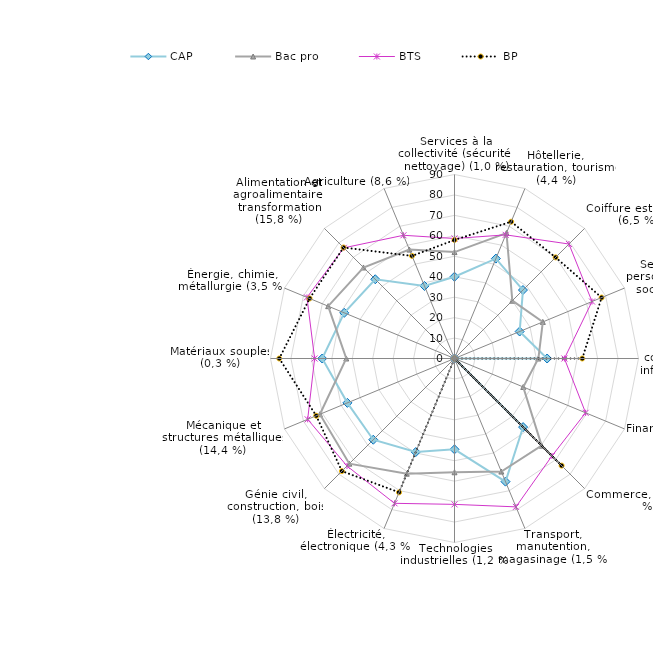
| Category | CAP | Bac pro | BTS | BP |
|---|---|---|---|---|
| Services à la collectivité (sécurité, nettoyage) (1,0 %) | 40 | 52.04 | 58.7 | 57.97 |
| Hôtellerie, restauration, tourisme (4,4 %) | 52.89 | 66.43 | 65.46 | 72.42 |
| Coiffure esthétique (6,5 %) | 47.36 | 40 | 79.19 | 69.95 |
| Services aux personnes (santé, social) (5,0 %) | 34.5 | 46.76 | 72.8 | 77.88 |
| Secrétariat, communication et information (3,2 %) | 45.3 | 41.03 | 53.76 | 62.5 |
| Finances, comptabilité (3,9 %) | 0 | 36.4 | 69.41 | 0 |
| Commerce, vente (12,5 %) | 47.45 | 60.3 | 67.41 | 74.1 |
| Transport, manutention, magasinage (1,5 %) | 65.19 | 59.86 | 78.55 | 0 |
| Technologies industrielles (1,2 %) | 44.44 | 55.65 | 71.35 | 0 |
| Électricité, électronique (4,3 %) | 49.52 | 61 | 76.67 | 70.87 |
| Génie civil, construction, bois (13,8 %) | 56.19 | 72.76 | 74.37 | 77.9 |
| Mécanique et structures métalliques (14,4 %) | 56.71 | 71.26 | 77.73 | 73.2 |
| Matériaux souples (0,3 %) | 64.71 | 52.94 | 68.42 | 85.71 |
| Énergie, chimie, métallurgie (3,5 %) | 58.37 | 66.89 | 78.11 | 76.72 |
| Alimentation et agroalimentaire, transformation (15,8 %) | 54.81 | 62.96 | 76.54 | 76.75 |
| Agriculture (8,6 %) | 38.4 | 57.65 | 65.23 | 54.31 |